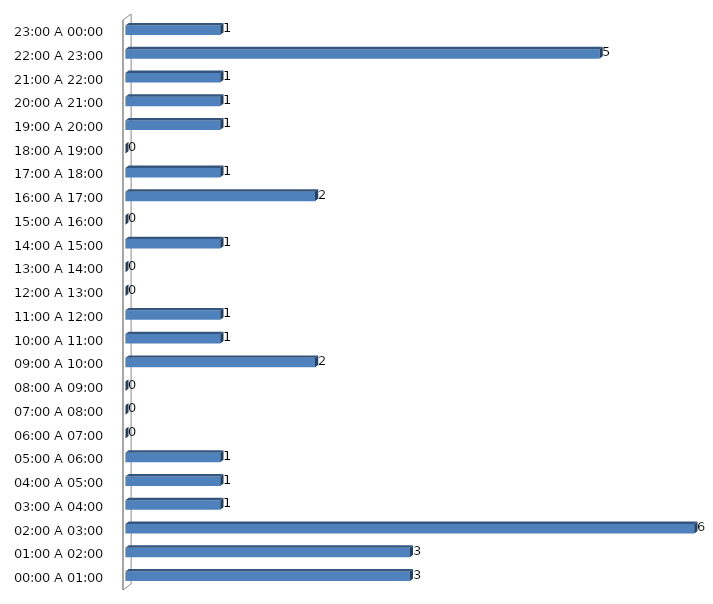
| Category | Series 0 |
|---|---|
| 00:00 A 01:00 | 3 |
| 01:00 A 02:00 | 3 |
| 02:00 A 03:00 | 6 |
| 03:00 A 04:00 | 1 |
| 04:00 A 05:00 | 1 |
| 05:00 A 06:00 | 1 |
| 06:00 A 07:00 | 0 |
| 07:00 A 08:00 | 0 |
| 08:00 A 09:00 | 0 |
| 09:00 A 10:00 | 2 |
| 10:00 A 11:00 | 1 |
| 11:00 A 12:00 | 1 |
| 12:00 A 13:00 | 0 |
| 13:00 A 14:00 | 0 |
| 14:00 A 15:00 | 1 |
| 15:00 A 16:00 | 0 |
| 16:00 A 17:00 | 2 |
| 17:00 A 18:00 | 1 |
| 18:00 A 19:00 | 0 |
| 19:00 A 20:00 | 1 |
| 20:00 A 21:00 | 1 |
| 21:00 A 22:00 | 1 |
| 22:00 A 23:00 | 5 |
| 23:00 A 00:00 | 1 |